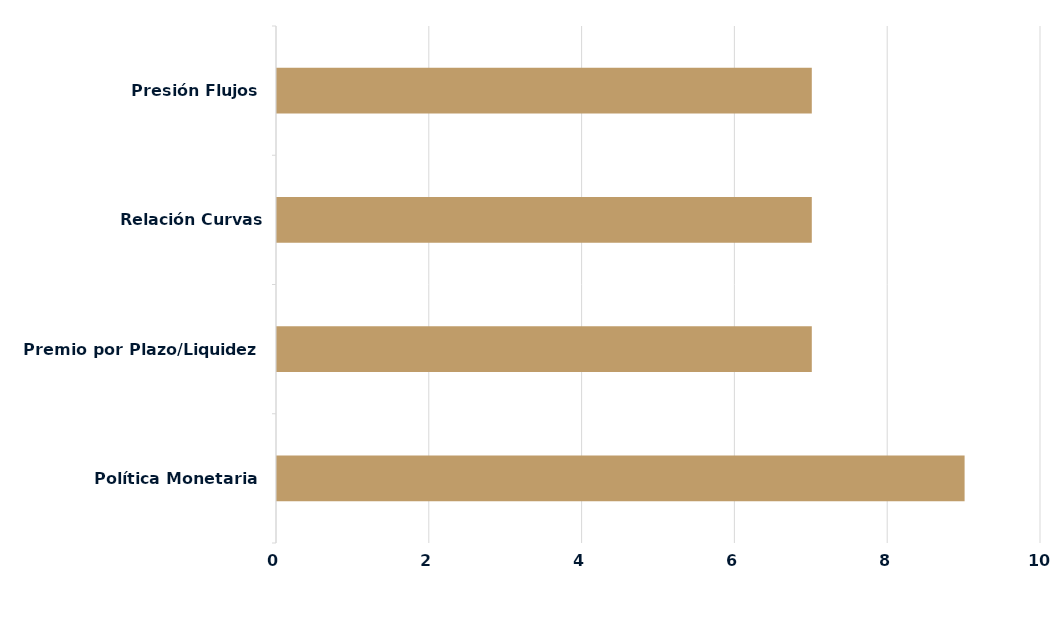
| Category | Series 0 |
|---|---|
| Política Monetaria | 9 |
| Premio por Plazo/Liquidez | 7 |
| Relación Curvas Internacionales | 7 |
| Presión Flujos | 7 |